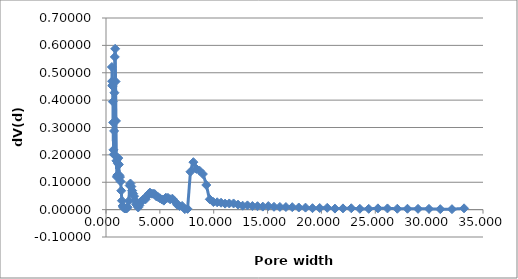
| Category | Series 0 |
|---|---|
| 0.545 | 0.521 |
| 0.567 | 0.469 |
| 0.59 | 0.454 |
| 0.614 | 0.451 |
| 0.64 | 0.394 |
| 0.666 | 0.318 |
| 0.694 | 0.218 |
| 0.723 | 0.202 |
| 0.753 | 0.287 |
| 0.785 | 0.427 |
| 0.818 | 0.558 |
| 0.852 | 0.588 |
| 0.889 | 0.468 |
| 0.926 | 0.324 |
| 0.966 | 0.178 |
| 1.007 | 0.12 |
| 1.051 | 0.126 |
| 1.096 | 0.169 |
| 1.144 | 0.188 |
| 1.193 | 0.164 |
| 1.245 | 0.125 |
| 1.299 | 0.119 |
| 1.356 | 0.103 |
| 1.416 | 0.069 |
| 1.478 | 0.033 |
| 1.543 | 0.013 |
| 1.611 | 0.008 |
| 1.682 | 0.006 |
| 1.756 | 0.004 |
| 1.834 | 0.004 |
| 1.915 | 0.004 |
| 2.0 | 0.009 |
| 2.1206 | 0.032 |
| 2.1948 | 0.088 |
| 2.2717 | 0.095 |
| 2.3512 | 0.084 |
| 2.4335 | 0.069 |
| 2.5186 | 0.059 |
| 2.6068 | 0.049 |
| 2.698 | 0.034 |
| 2.7925 | 0.02 |
| 2.8902 | 0.015 |
| 2.9914 | 0.008 |
| 3.0961 | 0.015 |
| 3.2044 | 0.028 |
| 3.3166 | 0.03 |
| 3.4326 | 0.036 |
| 3.5528 | 0.04 |
| 3.6771 | 0.038 |
| 3.8058 | 0.05 |
| 3.939 | 0.056 |
| 4.0769 | 0.062 |
| 4.2196 | 0.058 |
| 4.3673 | 0.058 |
| 4.5201 | 0.057 |
| 4.6784 | 0.048 |
| 4.8421 | 0.046 |
| 5.0116 | 0.041 |
| 5.187 | 0.037 |
| 5.369 | 0.033 |
| 5.556 | 0.044 |
| 5.751 | 0.043 |
| 5.952 | 0.038 |
| 6.16 | 0.04 |
| 6.376 | 0.031 |
| 6.599 | 0.018 |
| 6.83 | 0.013 |
| 7.069 | 0.013 |
| 7.317 | 0.002 |
| 7.573 | 0.003 |
| 7.8379 | 0.138 |
| 8.1122 | 0.173 |
| 8.3961 | 0.149 |
| 8.69 | 0.142 |
| 8.9941 | 0.13 |
| 9.3089 | 0.09 |
| 9.6347 | 0.038 |
| 9.972 | 0.028 |
| 10.321 | 0.027 |
| 10.682 | 0.025 |
| 11.056 | 0.022 |
| 11.443 | 0.023 |
| 11.8436 | 0.023 |
| 12.2581 | 0.018 |
| 12.6871 | 0.014 |
| 13.1312 | 0.015 |
| 13.5908 | 0.013 |
| 14.0664 | 0.012 |
| 14.5588 | 0.011 |
| 15.0683 | 0.013 |
| 15.5957 | 0.01 |
| 16.1416 | 0.01 |
| 16.7065 | 0.009 |
| 17.2912 | 0.009 |
| 17.8964 | 0.008 |
| 18.5228 | 0.007 |
| 19.1711 | 0.005 |
| 19.8421 | 0.006 |
| 20.5366 | 0.007 |
| 21.2553 | 0.004 |
| 21.9993 | 0.004 |
| 22.7693 | 0.005 |
| 23.5662 | 0.003 |
| 24.391 | 0.003 |
| 25.2447 | 0.005 |
| 26.1282 | 0.004 |
| 27.0427 | 0.003 |
| 27.9892 | 0.003 |
| 28.9689 | 0.003 |
| 29.9828 | 0.003 |
| 31.0322 | 0.002 |
| 32.1183 | 0.002 |
| 33.2424 | 0.005 |